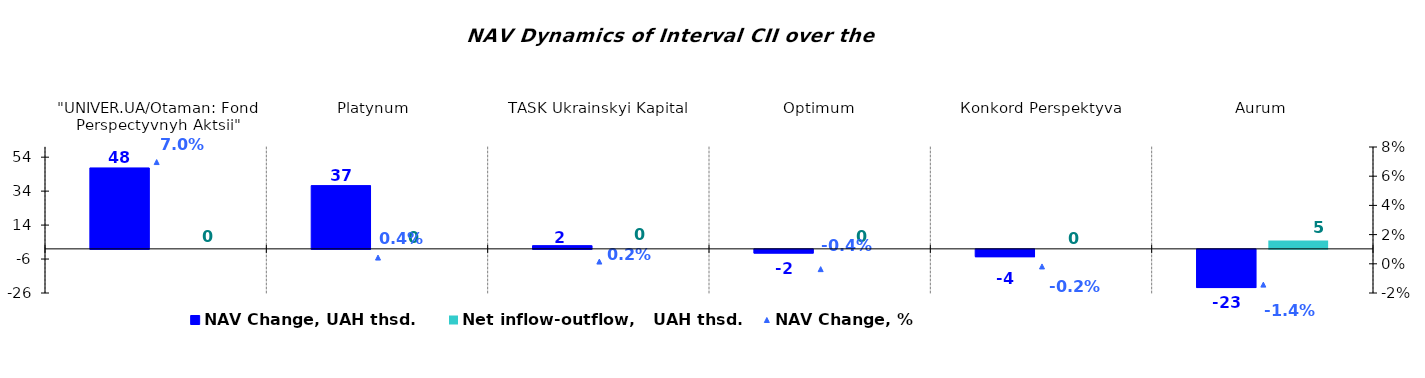
| Category | NAV Change, UAH thsd. | Net inflow-outflow,   UAH thsd. |
|---|---|---|
| "UNIVER.UA/Otaman: Fond Perspectyvnyh Aktsii" | 47.669 | 0 |
| Platynum  | 37.255 | 0 |
| TASK Ukrainskyi Kapital | 1.902 | 0 |
| Optimum | -2.212 | 0 |
| Кonkord Perspektyva | -4.291 | 0 |
| Аurum | -22.521 | 4.948 |